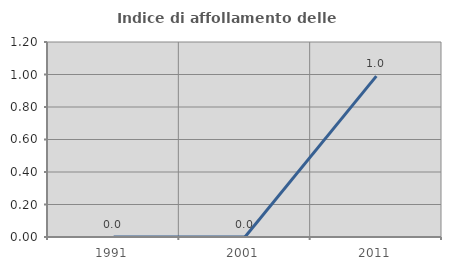
| Category | Indice di affollamento delle abitazioni  |
|---|---|
| 1991.0 | 0 |
| 2001.0 | 0 |
| 2011.0 | 0.99 |